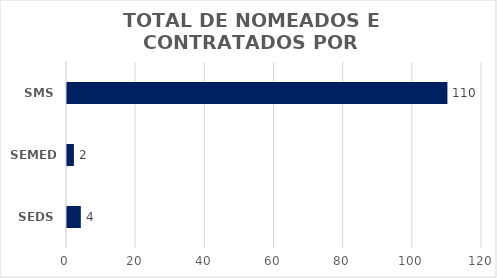
| Category | Series 0 |
|---|---|
| SEDS | 4 |
| SEMED | 2 |
| SMS | 110 |